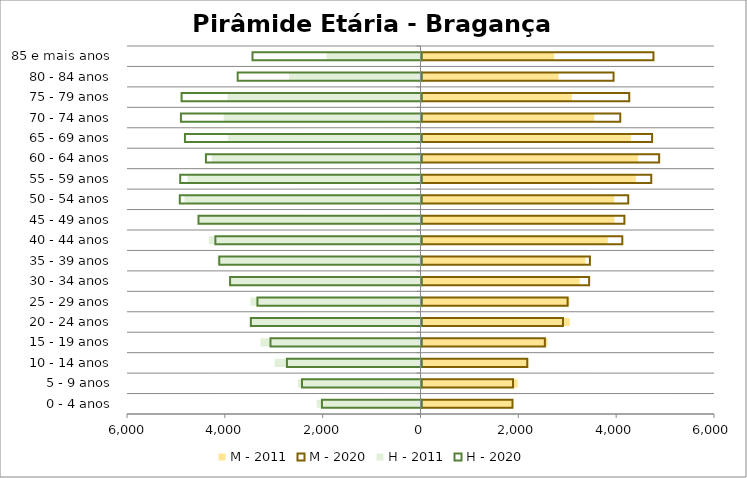
| Category | M - 2011 | M - 2020 | H - 2011 | H - 2020 |
|---|---|---|---|---|
| 0 - 4 anos | 1860 | 1860 | -2123 | -2035 |
| 5 - 9 anos | 1966 | 1871 | -2506 | -2443 |
| 10 - 14 anos | 2185 | 2162 | -2983 | -2751 |
| 15 - 19 anos | 2577 | 2522 | -3271 | -3087 |
| 20 - 24 anos | 3032 | 2892 | -3470 | -3489 |
| 25 - 29 anos | 3026 | 2987 | -3477 | -3354 |
| 30 - 34 anos | 3235 | 3427 | -3881 | -3913 |
| 35 - 39 anos | 3353 | 3443 | -4151 | -4134 |
| 40 - 44 anos | 3809 | 4105 | -4327 | -4214 |
| 45 - 49 anos | 3942 | 4148 | -4548 | -4559 |
| 50 - 54 anos | 3939 | 4226 | -4825 | -4941 |
| 55 - 59 anos | 4380 | 4697 | -4765 | -4933 |
| 60 - 64 anos | 4425 | 4858 | -4270 | -4407 |
| 65 - 69 anos | 4284 | 4714 | -3939 | -4836 |
| 70 - 74 anos | 3530 | 4063 | -4024 | -4918 |
| 75 - 79 anos | 3074 | 4247 | -3947 | -4905 |
| 80 - 84 anos | 2801 | 3926 | -2685 | -3758 |
| 85 e mais anos | 2714 | 4742 | -1919 | -3455 |